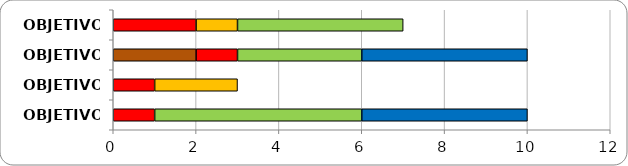
| Category | Series 0 | Series 1 | Series 2 | Series 3 | Series 4 | Series 5 |
|---|---|---|---|---|---|---|
| OBJETIVO 1 | 0 | 0 | 2 | 1 | 4 | 0 |
| OBJETIVO 2 | 2 | 0 | 1 | 0 | 3 | 4 |
| OBJETIVO 3 | 0 | 0 | 1 | 2 | 0 | 0 |
| OBJETIVO 4 | 0 | 0 | 1 | 0 | 5 | 4 |